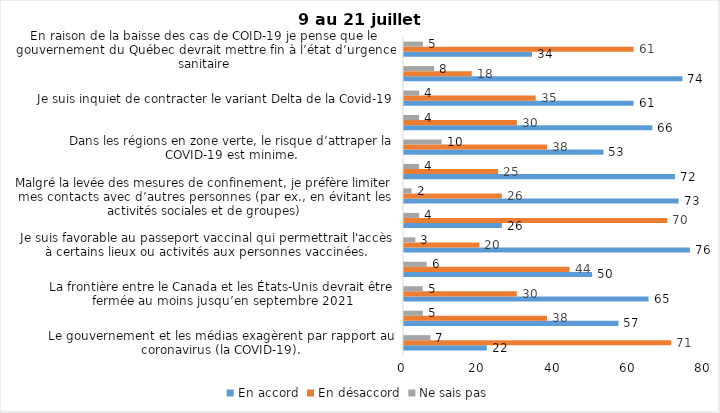
| Category | En accord | En désaccord | Ne sais pas |
|---|---|---|---|
| Le gouvernement et les médias exagèrent par rapport au coronavirus (la COVID-19). | 22 | 71 | 7 |
| J’ai peur que le système de santé soit débordé par les cas de COVID-19 suite au "déconfinement" | 57 | 38 | 5 |
| La frontière entre le Canada et les États-Unis devrait être fermée au moins jusqu’en septembre 2021 | 65 | 30 | 5 |
| Les personnes vaccinées contre la COVID-19 devraient avoir le droit de faire des rassemblements privés et de ne plus porter le masque dans les lieux publics. | 50 | 44 | 6 |
| Je suis favorable au passeport vaccinal qui permettrait l'accès à certains lieux ou activités aux personnes vaccinées. | 76 | 20 | 3 |
| Étant donné la progression de la vaccination et la diminution du nombre de cas de COVID-19, je pense qu’il est moins important de suivre les mesures de prévention. | 26 | 70 | 4 |
| Malgré la levée des mesures de confinement, je préfère limiter mes contacts avec d’autres personnes (par ex., en évitant les activités sociales et de groupes) | 73 | 26 | 2 |
| J’ai peur qu’il y ait une 4e vague de la COVID-19. | 72 | 25 | 4 |
| Dans les régions en zone verte, le risque d’attraper la COVID-19 est minime. | 53 | 38 | 10 |
| Si les cas de COVID-19 augmentent cet automne, je suis favorable à la mise en place de mesures de confinement (ex. fermeture de services non essentiels, interdiction des rassemblements privés) | 66 | 30 | 4 |
| Je suis inquiet de contracter le variant Delta de la Covid-19 | 61 | 35 | 4 |
| Je suis confiant que la vaccination protège efficacement contre les variants de la COVID-19 | 74 | 18 | 8 |
| En raison de la baisse des cas de COID-19 je pense que le gouvernement du Québec devrait mettre fin à l’état d’urgence sanitaire | 34 | 61 | 5 |